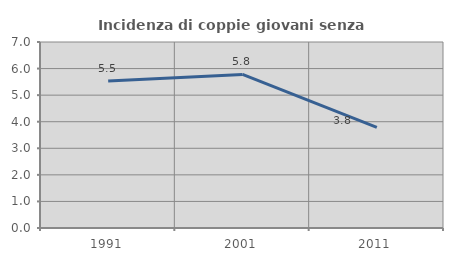
| Category | Incidenza di coppie giovani senza figli |
|---|---|
| 1991.0 | 5.535 |
| 2001.0 | 5.781 |
| 2011.0 | 3.788 |